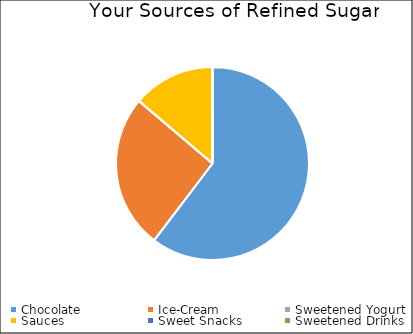
| Category | Series 0 |
|---|---|
| Chocolate | 35 |
| Ice-Cream | 15 |
| Sweetened Yogurt | 0 |
| Sauces | 8 |
| Sweet Snacks | 0 |
| Sweetened Drinks | 0 |